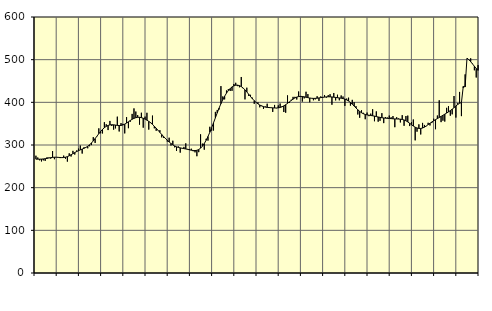
| Category | Piggar | Series 1 |
|---|---|---|
| nan | 274.9 | 266.76 |
| 1.0 | 270.7 | 266.76 |
| 1.0 | 264.1 | 266.82 |
| 1.0 | 261.5 | 266.96 |
| 1.0 | 264 | 267.32 |
| 1.0 | 262.8 | 267.86 |
| 1.0 | 271.2 | 268.57 |
| 1.0 | 270.6 | 269.52 |
| 1.0 | 268 | 270.36 |
| 1.0 | 285.9 | 271.01 |
| 1.0 | 266.7 | 271.34 |
| 1.0 | 271.1 | 271.36 |
| nan | 270.4 | 271.1 |
| 2.0 | 269.3 | 270.68 |
| 2.0 | 271.1 | 270.42 |
| 2.0 | 275.1 | 270.6 |
| 2.0 | 267.8 | 271.37 |
| 2.0 | 261.1 | 272.78 |
| 2.0 | 280.5 | 274.76 |
| 2.0 | 273 | 277.16 |
| 2.0 | 286.3 | 279.71 |
| 2.0 | 277.6 | 282.25 |
| 2.0 | 287.2 | 284.6 |
| 2.0 | 291.5 | 286.7 |
| nan | 298.7 | 288.58 |
| 3.0 | 279.9 | 290.39 |
| 3.0 | 294.8 | 292.26 |
| 3.0 | 295 | 294.38 |
| 3.0 | 292.2 | 297.07 |
| 3.0 | 297.1 | 300.49 |
| 3.0 | 299.8 | 304.65 |
| 3.0 | 318.4 | 309.52 |
| 3.0 | 304.8 | 315.02 |
| 3.0 | 320.2 | 320.77 |
| 3.0 | 339 | 326.52 |
| 3.0 | 327.5 | 331.91 |
| nan | 327.1 | 336.63 |
| 4.0 | 353.4 | 340.6 |
| 4.0 | 348.6 | 343.68 |
| 4.0 | 335 | 345.82 |
| 4.0 | 356.4 | 347.07 |
| 4.0 | 344.6 | 347.5 |
| 4.0 | 336 | 347.3 |
| 4.0 | 338.9 | 346.66 |
| 4.0 | 366.4 | 345.93 |
| 4.0 | 331.7 | 345.59 |
| 4.0 | 351.3 | 345.84 |
| 4.0 | 349.6 | 346.94 |
| nan | 327.2 | 348.92 |
| 5.0 | 365.4 | 351.48 |
| 5.0 | 339.4 | 354.41 |
| 5.0 | 354.5 | 357.47 |
| 5.0 | 372.9 | 360.26 |
| 5.0 | 385.8 | 362.48 |
| 5.0 | 378.4 | 364.04 |
| 5.0 | 370.1 | 364.9 |
| 5.0 | 347.7 | 364.9 |
| 5.0 | 375.6 | 364.09 |
| 5.0 | 340.6 | 362.66 |
| 5.0 | 366.5 | 360.66 |
| nan | 375.5 | 358.22 |
| 6.0 | 336.1 | 355.36 |
| 6.0 | 353.4 | 352.04 |
| 6.0 | 368.9 | 348.28 |
| 6.0 | 339.1 | 344.04 |
| 6.0 | 333.3 | 339.4 |
| 6.0 | 334 | 334.5 |
| 6.0 | 334.7 | 329.5 |
| 6.0 | 317.9 | 324.62 |
| 6.0 | 316.8 | 319.93 |
| 6.0 | 316.4 | 315.39 |
| 6.0 | 308.1 | 311.11 |
| nan | 317.1 | 307.07 |
| 7.0 | 298.7 | 303.42 |
| 7.0 | 310 | 300.32 |
| 7.0 | 294.5 | 297.73 |
| 7.0 | 286.1 | 295.71 |
| 7.0 | 296.6 | 294.33 |
| 7.0 | 282.1 | 293.29 |
| 7.0 | 292.7 | 292.37 |
| 7.0 | 295.6 | 291.51 |
| 7.0 | 303.9 | 290.65 |
| 7.0 | 290.8 | 289.76 |
| 7.0 | 290.6 | 288.76 |
| nan | 291.3 | 287.78 |
| 8.0 | 285.4 | 287.1 |
| 8.0 | 282.8 | 286.96 |
| 8.0 | 273.7 | 287.58 |
| 8.0 | 283.2 | 289.35 |
| 8.0 | 325 | 292.53 |
| 8.0 | 303.2 | 297.2 |
| 8.0 | 289 | 303.42 |
| 8.0 | 314.5 | 311.05 |
| 8.0 | 310.3 | 319.9 |
| 8.0 | 342.7 | 329.81 |
| 8.0 | 333.6 | 340.63 |
| nan | 334 | 352.04 |
| 9.0 | 377.6 | 363.68 |
| 9.0 | 382.2 | 375.25 |
| 9.0 | 383.2 | 386.45 |
| 9.0 | 438 | 396.85 |
| 9.0 | 413.8 | 406.14 |
| 9.0 | 406.9 | 414.33 |
| 9.0 | 427.8 | 421.45 |
| 9.0 | 430.9 | 427.51 |
| 9.0 | 426.6 | 432.4 |
| 9.0 | 427 | 436.12 |
| 9.0 | 443 | 438.66 |
| nan | 445.8 | 440.07 |
| 10.0 | 438 | 440.26 |
| 10.0 | 435.3 | 439.14 |
| 10.0 | 459.4 | 436.83 |
| 10.0 | 432.9 | 433.5 |
| 10.0 | 406.9 | 429.27 |
| 10.0 | 434.3 | 424.32 |
| 10.0 | 415.1 | 418.98 |
| 10.0 | 417.6 | 413.55 |
| 10.0 | 410.9 | 408.44 |
| 10.0 | 396.5 | 403.85 |
| 10.0 | 399.8 | 399.89 |
| nan | 400.1 | 396.52 |
| 11.0 | 388.3 | 393.74 |
| 11.0 | 392.4 | 391.53 |
| 11.0 | 384.5 | 389.88 |
| 11.0 | 390.2 | 388.79 |
| 11.0 | 396.8 | 388.14 |
| 11.0 | 387.1 | 387.77 |
| 11.0 | 387 | 387.42 |
| 11.0 | 377.5 | 387.1 |
| 11.0 | 393.9 | 386.82 |
| 11.0 | 386.2 | 386.78 |
| 11.0 | 392.9 | 387.09 |
| nan | 397.2 | 387.9 |
| 12.0 | 390.7 | 389.4 |
| 12.0 | 377.3 | 391.64 |
| 12.0 | 375.6 | 394.47 |
| 12.0 | 416.2 | 397.66 |
| 12.0 | 398.5 | 401.02 |
| 12.0 | 406.1 | 404.36 |
| 12.0 | 412.8 | 407.5 |
| 12.0 | 412.9 | 410.23 |
| 12.0 | 406.6 | 412.3 |
| 12.0 | 425.4 | 413.56 |
| 12.0 | 412.5 | 414 |
| nan | 401.7 | 413.72 |
| 13.0 | 409.2 | 412.94 |
| 13.0 | 424.8 | 411.95 |
| 13.0 | 419.3 | 410.99 |
| 13.0 | 400.1 | 410.13 |
| 13.0 | 409.2 | 409.51 |
| 13.0 | 404.8 | 409.24 |
| 13.0 | 406.9 | 409.34 |
| 13.0 | 414.3 | 409.71 |
| 13.0 | 403.3 | 410.31 |
| 13.0 | 413.9 | 411 |
| 13.0 | 412.4 | 411.64 |
| nan | 417.2 | 412.28 |
| 14.0 | 411 | 412.8 |
| 14.0 | 416.9 | 413.02 |
| 14.0 | 419 | 412.92 |
| 14.0 | 394.3 | 412.58 |
| 14.0 | 421.9 | 412.08 |
| 14.0 | 404.5 | 411.46 |
| 14.0 | 417.8 | 410.84 |
| 14.0 | 404.7 | 410.29 |
| 14.0 | 416.1 | 409.68 |
| 14.0 | 413.6 | 408.84 |
| 14.0 | 391.6 | 407.56 |
| nan | 408.8 | 405.65 |
| 15.0 | 410.9 | 403.03 |
| 15.0 | 392.3 | 399.67 |
| 15.0 | 405.8 | 395.63 |
| 15.0 | 400.2 | 391.23 |
| 15.0 | 391.1 | 386.76 |
| 15.0 | 371.5 | 382.48 |
| 15.0 | 363.8 | 378.74 |
| 15.0 | 381.4 | 375.62 |
| 15.0 | 375.4 | 373.27 |
| 15.0 | 360.4 | 371.61 |
| 15.0 | 376 | 370.54 |
| nan | 367.6 | 369.85 |
| 16.0 | 373.5 | 369.21 |
| 16.0 | 383.8 | 368.47 |
| 16.0 | 355.7 | 367.64 |
| 16.0 | 378.8 | 366.67 |
| 16.0 | 354.6 | 365.64 |
| 16.0 | 356.7 | 364.71 |
| 16.0 | 374.6 | 363.93 |
| 16.0 | 351.3 | 363.36 |
| 16.0 | 365.6 | 362.89 |
| 16.0 | 364.2 | 362.47 |
| 16.0 | 369 | 362.14 |
| nan | 365 | 361.82 |
| 17.0 | 367.8 | 361.45 |
| 17.0 | 341.7 | 361.15 |
| 17.0 | 365.1 | 360.98 |
| 17.0 | 362.1 | 360.82 |
| 17.0 | 352.9 | 360.51 |
| 17.0 | 369.9 | 359.86 |
| 17.0 | 345 | 358.61 |
| 17.0 | 367.9 | 356.66 |
| 17.0 | 368.9 | 354.08 |
| 17.0 | 344.4 | 350.99 |
| 17.0 | 353.7 | 347.66 |
| nan | 359.8 | 344.4 |
| 18.0 | 310.9 | 341.71 |
| 18.0 | 331.2 | 339.86 |
| 18.0 | 348.4 | 338.86 |
| 18.0 | 324.7 | 338.78 |
| 18.0 | 351.8 | 339.78 |
| 18.0 | 347 | 341.85 |
| 18.0 | 344.1 | 344.63 |
| 18.0 | 352.1 | 347.76 |
| 18.0 | 345.8 | 350.9 |
| 18.0 | 351.4 | 353.96 |
| 18.0 | 361.6 | 356.76 |
| nan | 337 | 359.39 |
| 19.0 | 369.1 | 361.96 |
| 19.0 | 404.8 | 364.47 |
| 19.0 | 353.6 | 367 |
| 19.0 | 357 | 369.6 |
| 19.0 | 354.9 | 372.22 |
| 19.0 | 387.1 | 374.83 |
| 19.0 | 391 | 377.6 |
| 19.0 | 368.6 | 380.62 |
| 19.0 | 371.9 | 383.95 |
| 19.0 | 414.8 | 387.58 |
| 19.0 | 364.3 | 391.4 |
| nan | 398.2 | 394.98 |
| 20.0 | 424.4 | 397.85 |
| 20.0 | 367.7 | 399.51 |
| 20.0 | 433.8 | 437.32 |
| 20.0 | 465.5 | 436.23 |
| 20.0 | 503.8 | 503.66 |
| 20.0 | 499.3 | 499.96 |
| 20.0 | 503.2 | 495.22 |
| 20.0 | 490.7 | 489.92 |
| 20.0 | 475.1 | 484.55 |
| 20.0 | 458.2 | 479.4 |
| 20.0 | 487.3 | 474.74 |